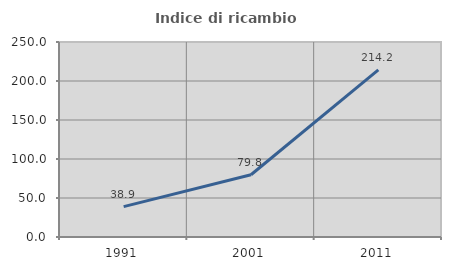
| Category | Indice di ricambio occupazionale  |
|---|---|
| 1991.0 | 38.889 |
| 2001.0 | 79.839 |
| 2011.0 | 214.167 |